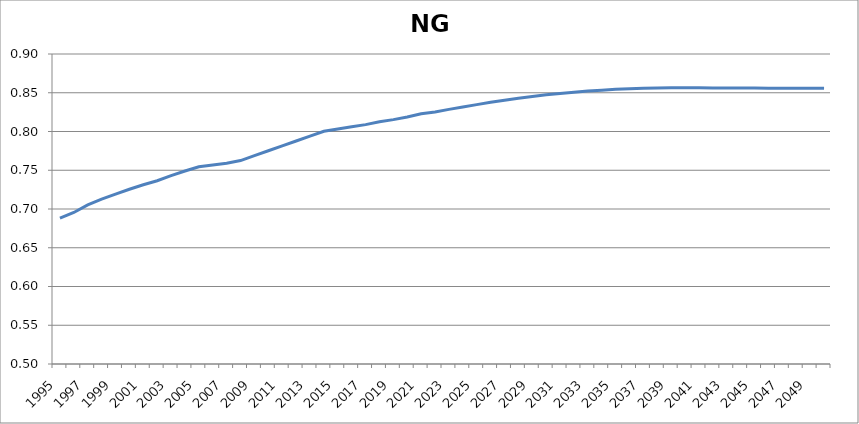
| Category | NGDryer |
|---|---|
| 1995.0 | 0.688 |
| 1996.0 | 0.696 |
| 1997.0 | 0.705 |
| 1998.0 | 0.713 |
| 1999.0 | 0.719 |
| 2000.0 | 0.725 |
| 2001.0 | 0.731 |
| 2002.0 | 0.736 |
| 2003.0 | 0.743 |
| 2004.0 | 0.749 |
| 2005.0 | 0.754 |
| 2006.0 | 0.757 |
| 2007.0 | 0.759 |
| 2008.0 | 0.763 |
| 2009.0 | 0.769 |
| 2010.0 | 0.775 |
| 2011.0 | 0.781 |
| 2012.0 | 0.788 |
| 2013.0 | 0.794 |
| 2014.0 | 0.8 |
| 2015.0 | 0.803 |
| 2016.0 | 0.806 |
| 2017.0 | 0.809 |
| 2018.0 | 0.813 |
| 2019.0 | 0.815 |
| 2020.0 | 0.819 |
| 2021.0 | 0.823 |
| 2022.0 | 0.825 |
| 2023.0 | 0.829 |
| 2024.0 | 0.832 |
| 2025.0 | 0.835 |
| 2026.0 | 0.838 |
| 2027.0 | 0.84 |
| 2028.0 | 0.843 |
| 2029.0 | 0.845 |
| 2030.0 | 0.847 |
| 2031.0 | 0.849 |
| 2032.0 | 0.851 |
| 2033.0 | 0.852 |
| 2034.0 | 0.853 |
| 2035.0 | 0.854 |
| 2036.0 | 0.855 |
| 2037.0 | 0.856 |
| 2038.0 | 0.856 |
| 2039.0 | 0.856 |
| 2040.0 | 0.857 |
| 2041.0 | 0.856 |
| 2042.0 | 0.856 |
| 2043.0 | 0.856 |
| 2044.0 | 0.856 |
| 2045.0 | 0.856 |
| 2046.0 | 0.856 |
| 2047.0 | 0.856 |
| 2048.0 | 0.856 |
| 2049.0 | 0.856 |
| 2050.0 | 0.856 |